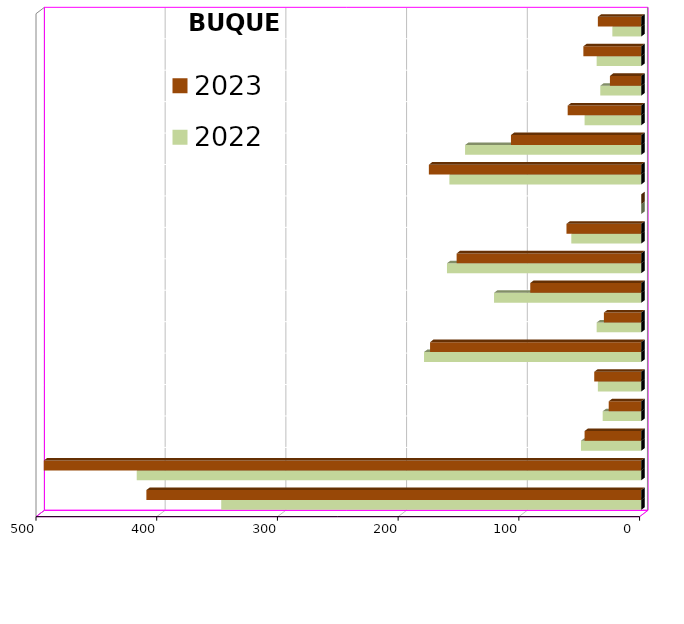
| Category | 2022 | 2023 |
|---|---|---|
| ICAVE | 348 | 410 |
| CICE | 418 | 495 |
| T. C. E. | 50 | 47 |
| CARGILL | 32 | 27 |
| TMV | 36 | 39 |
| SSA | 180 | 175 |
| SEPSA | 37 | 31 |
| VOPAK | 122 | 92 |
| CPV | 161 | 153 |
| EXCELLENCE | 58 | 62 |
| APASCO | 0 | 0 |
| SIPPB | 159 | 176 |
| PEMEX | 146 | 108 |
| PETRA | 47 | 61 |
| OPEVER | 34 | 26 |
| ESJ Renovable III | 37 | 48 |
| Tramitadora del Pac. | 24 | 36 |